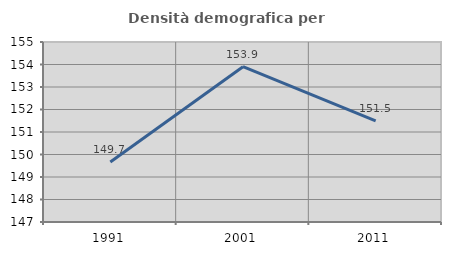
| Category | Densità demografica |
|---|---|
| 1991.0 | 149.67 |
| 2001.0 | 153.903 |
| 2011.0 | 151.495 |